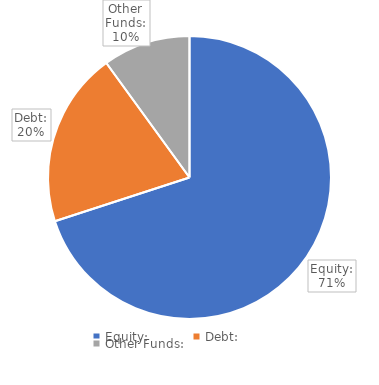
| Category | Series 0 |
|---|---|
| Equity: | 0.7 |
| Debt: | 0.2 |
| Other Funds: | 0.1 |